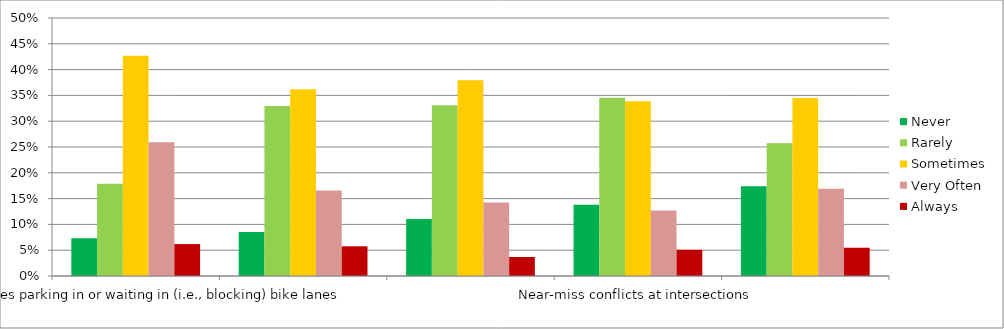
| Category | Never | Rarely | Sometimes | Very Often | Always |
|---|---|---|---|---|---|
| Motor vehicles parking in or waiting in (i.e., blocking) bike lanes | 0.073 | 0.179 | 0.427 | 0.259 | 0.062 |
| Vehicles not sharing the roadway | 0.085 | 0.33 | 0.362 | 0.166 | 0.058 |
| Near-miss conflicts at driveways | 0.11 | 0.331 | 0.379 | 0.142 | 0.037 |
| Near-miss conflicts at intersections | 0.138 | 0.346 | 0.339 | 0.127 | 0.051 |
| Motor vehicles stopped inside the bike box at the Main Street intersection during red traffic lights | 0.174 | 0.257 | 0.345 | 0.169 | 0.055 |